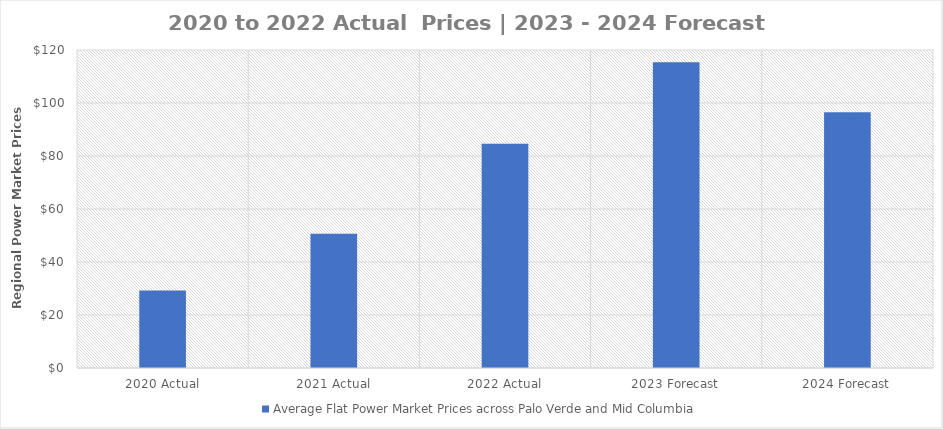
| Category | Average Flat Power Market Prices across Palo Verde and Mid Columbia |
|---|---|
| 2020 Actual | 29.271 |
| 2021 Actual | 50.66 |
| 2022 Actual | 84.639 |
| 2023 Forecast | 115.355 |
| 2024 Forecast | 96.554 |